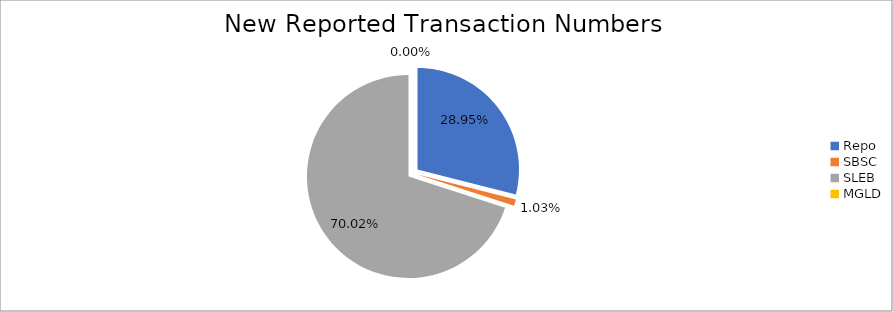
| Category | Series 0 |
|---|---|
| Repo | 226574 |
| SBSC | 8037 |
| SLEB | 547889 |
| MGLD | 11 |